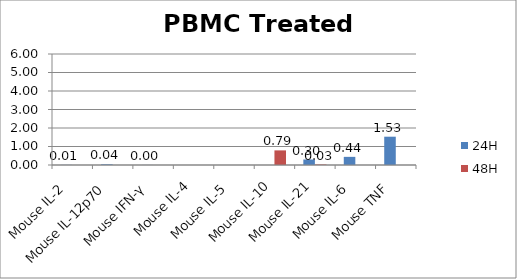
| Category | 24H | 48H |
|---|---|---|
| Mouse IL-2  | 0.007 | 0 |
| Mouse IL-12p70  | 0.037 | 0 |
| Mouse IFN-γ  | 0.003 | 0 |
| Mouse IL-4 | 0 | 0 |
| Mouse IL-5  | 0 | 0 |
| Mouse IL-10 | 0 | 0.79 |
| Mouse IL-21 | 0.297 | 0.027 |
| Mouse IL-6  | 0.44 | 0 |
| Mouse TNF  | 1.53 | 0 |